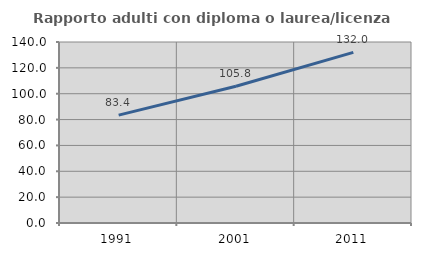
| Category | Rapporto adulti con diploma o laurea/licenza media  |
|---|---|
| 1991.0 | 83.448 |
| 2001.0 | 105.816 |
| 2011.0 | 131.985 |